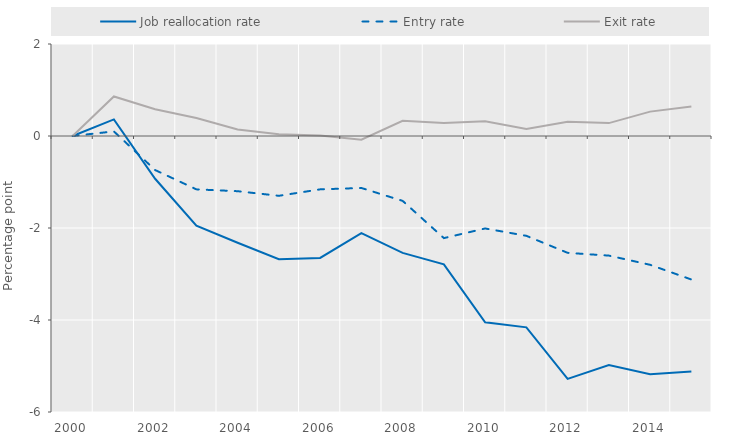
| Category | Job reallocation rate | Entry rate | Exit rate |
|---|---|---|---|
| 2000.0 | 0 | 0 | 0 |
| 2001.0 | 0.36 | 0.1 | 0.86 |
| 2002.0 | -0.93 | -0.74 | 0.58 |
| 2003.0 | -1.95 | -1.16 | 0.39 |
| 2004.0 | -2.32 | -1.2 | 0.14 |
| 2005.0 | -2.68 | -1.3 | 0.04 |
| 2006.0 | -2.65 | -1.16 | 0.01 |
| 2007.0 | -2.11 | -1.13 | -0.08 |
| 2008.0 | -2.54 | -1.41 | 0.33 |
| 2009.0 | -2.79 | -2.22 | 0.28 |
| 2010.0 | -4.05 | -2.01 | 0.32 |
| 2011.0 | -4.16 | -2.17 | 0.15 |
| 2012.0 | -5.28 | -2.54 | 0.31 |
| 2013.0 | -4.98 | -2.6 | 0.28 |
| 2014.0 | -5.18 | -2.8 | 0.53 |
| 2015.0 | -5.12 | -3.12 | 0.64 |